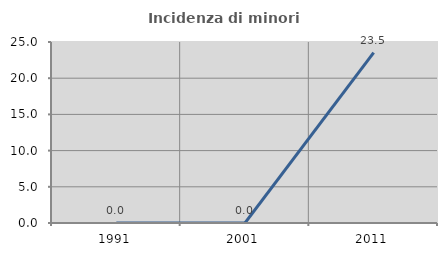
| Category | Incidenza di minori stranieri |
|---|---|
| 1991.0 | 0 |
| 2001.0 | 0 |
| 2011.0 | 23.529 |